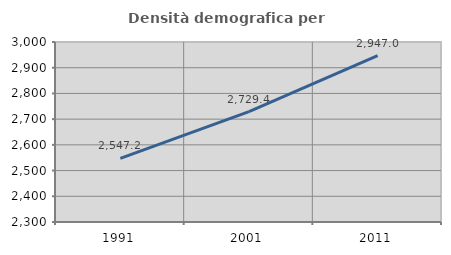
| Category | Densità demografica |
|---|---|
| 1991.0 | 2547.186 |
| 2001.0 | 2729.398 |
| 2011.0 | 2947.046 |